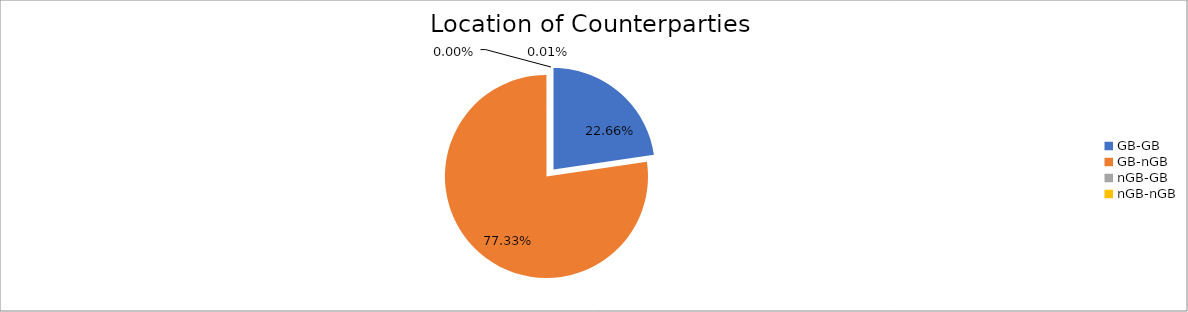
| Category | Series 0 |
|---|---|
| GB-GB | 1935120.436 |
| GB-nGB | 6602538.326 |
| nGB-GB | 54.678 |
| nGB-nGB | 577.181 |